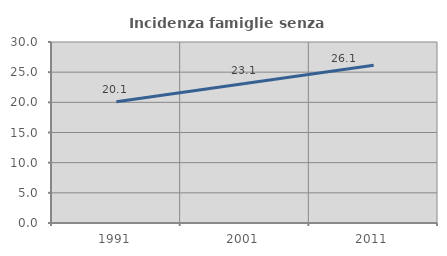
| Category | Incidenza famiglie senza nuclei |
|---|---|
| 1991.0 | 20.101 |
| 2001.0 | 23.133 |
| 2011.0 | 26.147 |